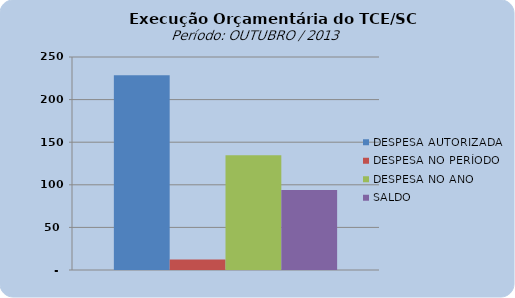
| Category | DESPESA AUTORIZADA | DESPESA NO PERÍODO | DESPESA NO ANO | SALDO |
|---|---|---|---|---|
| 0 | 228618664.44 | 12258661.38 | 134777397.54 | 93841266.9 |